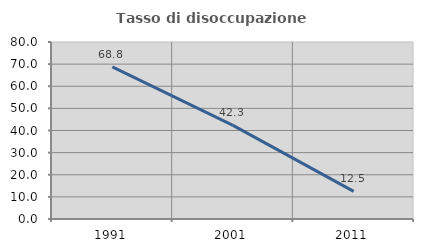
| Category | Tasso di disoccupazione giovanile  |
|---|---|
| 1991.0 | 68.75 |
| 2001.0 | 42.308 |
| 2011.0 | 12.5 |